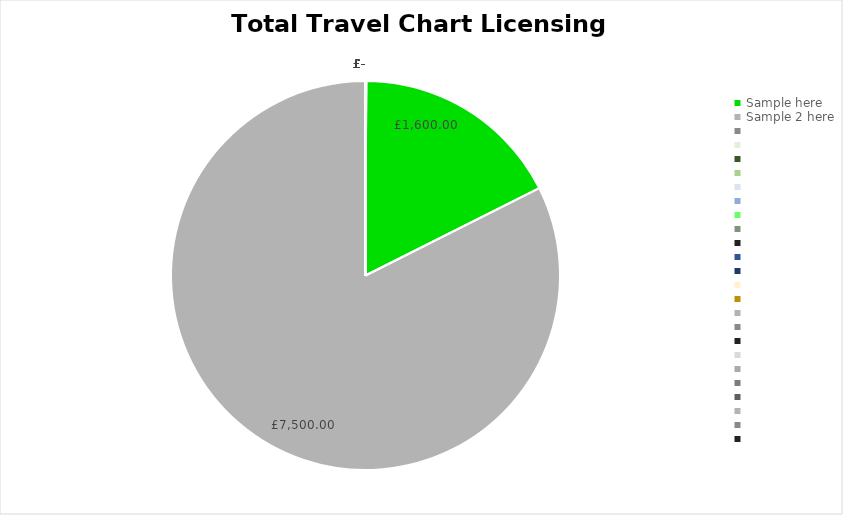
| Category | Travel App Spend |
|---|---|
| Sample here | 1600 |
| Sample 2 here | 7500 |